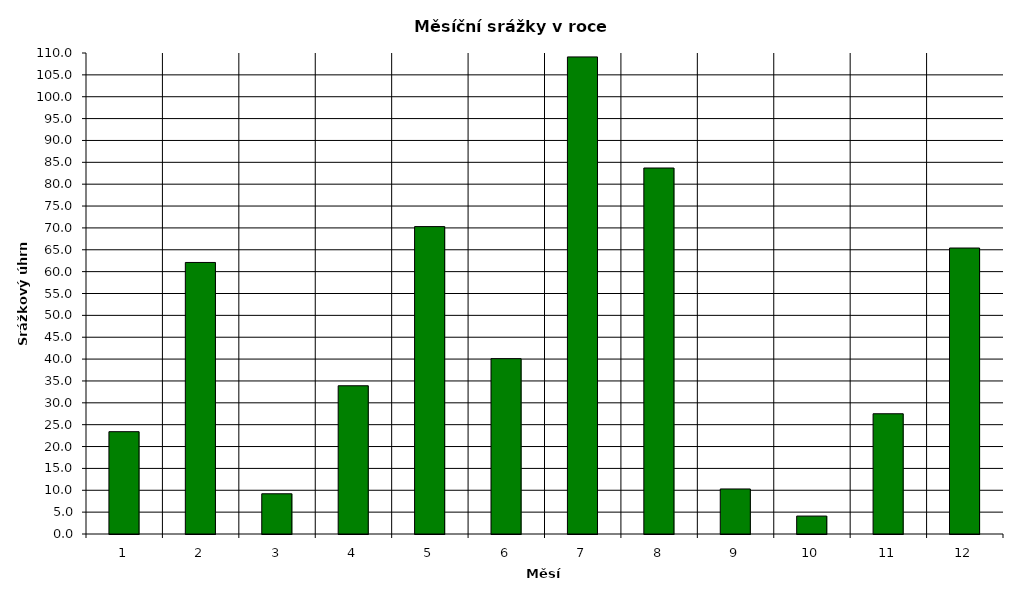
| Category | Series 0 |
|---|---|
| 0 | 23.4 |
| 1 | 62.1 |
| 2 | 9.2 |
| 3 | 33.9 |
| 4 | 70.3 |
| 5 | 40.1 |
| 6 | 109.1 |
| 7 | 83.7 |
| 8 | 10.3 |
| 9 | 4.1 |
| 10 | 27.5 |
| 11 | 65.4 |